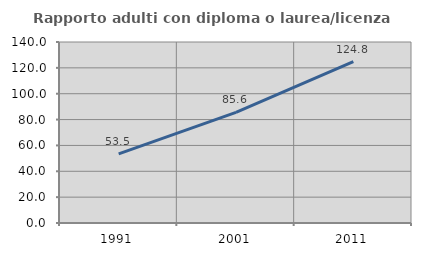
| Category | Rapporto adulti con diploma o laurea/licenza media  |
|---|---|
| 1991.0 | 53.502 |
| 2001.0 | 85.569 |
| 2011.0 | 124.792 |